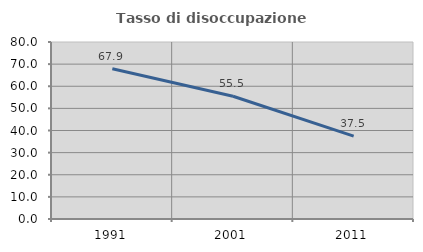
| Category | Tasso di disoccupazione giovanile  |
|---|---|
| 1991.0 | 67.923 |
| 2001.0 | 55.459 |
| 2011.0 | 37.471 |